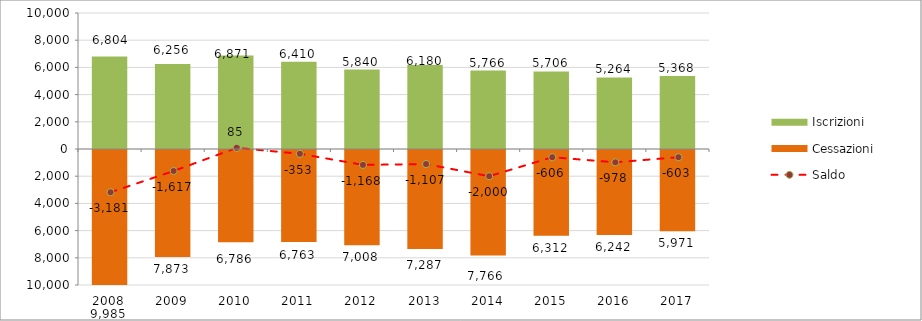
| Category | Iscrizioni | Cessazioni |
|---|---|---|
| 2008.0 | 6804 | -9985 |
| 2009.0 | 6256 | -7873 |
| 2010.0 | 6871 | -6786 |
| 2011.0 | 6410 | -6763 |
| 2012.0 | 5840 | -7008 |
| 2013.0 | 6180 | -7287 |
| 2014.0 | 5766 | -7766 |
| 2015.0 | 5706 | -6312 |
| 2016.0 | 5264 | -6242 |
| 2017.0 | 5368 | -5971 |